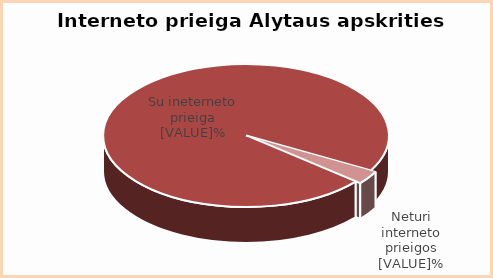
| Category | Series 0 |
|---|---|
| Su internetu | 97 |
| Be interneto | 3 |